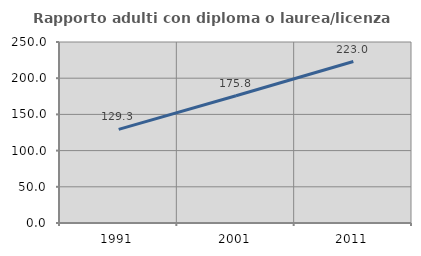
| Category | Rapporto adulti con diploma o laurea/licenza media  |
|---|---|
| 1991.0 | 129.262 |
| 2001.0 | 175.813 |
| 2011.0 | 223.05 |